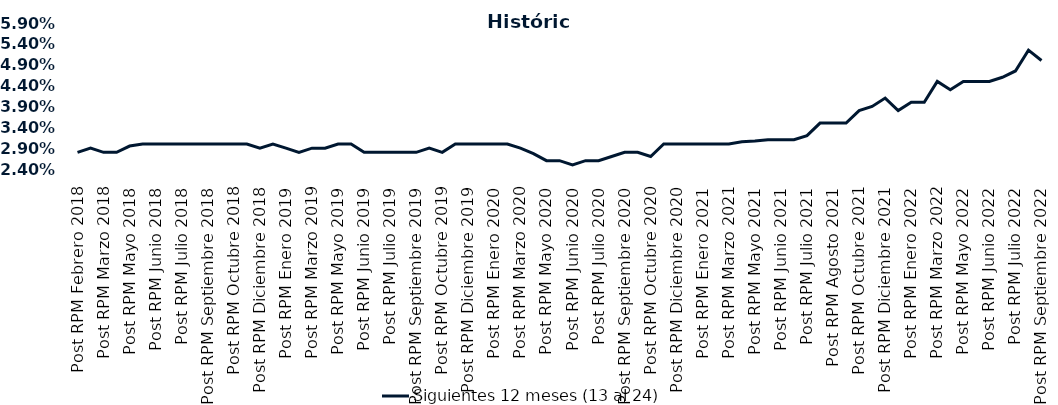
| Category | Siguientes 12 meses (13 al 24)  |
|---|---|
| Post RPM Febrero 2018 | 0.028 |
| Pre RPM Marzo 2018 | 0.029 |
| Post RPM Marzo 2018 | 0.028 |
| Pre RPM Mayo 2018 | 0.028 |
| Post RPM Mayo 2018 | 0.03 |
| Pre RPM Junio 2018 | 0.03 |
| Post RPM Junio 2018 | 0.03 |
| Pre RPM Julio 2018 | 0.03 |
| Post RPM Julio 2018 | 0.03 |
| Pre RPM Septiembre 2018 | 0.03 |
| Post RPM Septiembre 2018 | 0.03 |
| Pre RPM Octubre 2018 | 0.03 |
| Post RPM Octubre 2018 | 0.03 |
| Pre RPM Diciembre 2018 | 0.03 |
| Post RPM Diciembre 2018 | 0.029 |
| Pre RPM Enero 2019 | 0.03 |
| Post RPM Enero 2019 | 0.029 |
| Pre RPM Marzo 2019 | 0.028 |
| Post RPM Marzo 2019 | 0.029 |
| Pre RPM Mayo 2019 | 0.029 |
| Post RPM Mayo 2019 | 0.03 |
| Pre RPM Junio 2019 | 0.03 |
| Post RPM Junio 2019 | 0.028 |
| Pre RPM Julio 2019 | 0.028 |
| Post RPM Julio 2019 | 0.028 |
| Pre RPM Septiembre 2019 | 0.028 |
| Post RPM Septiembre 2019 | 0.028 |
| Pre RPM Octubre 2019 | 0.029 |
| Post RPM Octubre 2019 | 0.028 |
| Pre RPM Diciembre 2019 | 0.03 |
| Post RPM Diciembre 2019 | 0.03 |
| Pre RPM Enero 2020 | 0.03 |
| Post RPM Enero 2020 | 0.03 |
| Pre RPM Marzo 2020 | 0.03 |
| Post RPM Marzo 2020 | 0.029 |
| Pre RPM Mayo 2020 | 0.028 |
| Post RPM Mayo 2020 | 0.026 |
| Pre RPM Junio 2020 | 0.026 |
| Post RPM Junio 2020 | 0.025 |
| Pre RPM Julio 2020 | 0.026 |
| Post RPM Julio 2020 | 0.026 |
| Pre RPM Septiembre 2020 | 0.027 |
| Post RPM Septiembre 2020 | 0.028 |
| Pre RPM Octubre 2020 | 0.028 |
| Post RPM Octubre 2020 | 0.027 |
| Pre RPM Diciembre 2020 | 0.03 |
| Post RPM Diciembre 2020 | 0.03 |
| Pre RPM Enero 2021 | 0.03 |
| Post RPM Enero 2021 | 0.03 |
| Pre RPM Marzo 2021 | 0.03 |
| Post RPM Marzo 2021 | 0.03 |
| Pre RPM Mayo 2021 | 0.031 |
| Post RPM Mayo 2021 | 0.031 |
| Pre RPM Junio 2021 | 0.031 |
| Post RPM Junio 2021 | 0.031 |
| Pre RPM Julio 2021 | 0.031 |
| Post RPM Julio 2021 | 0.032 |
| Pre RPM Agosto 2021 | 0.035 |
| Post RPM Agosto 2021 | 0.035 |
| Pre RPM Octubre 2021 | 0.035 |
| Post RPM Octubre 2021 | 0.038 |
| Pre RPM Diciembre 2021 | 0.039 |
| Post RPM Diciembre 2021 | 0.041 |
| Pre RPM Enero 2022 | 0.038 |
| Post RPM Enero 2022 | 0.04 |
| Pre RPM Marzo 2022 | 0.04 |
| Post RPM Marzo 2022 | 0.045 |
| Pre RPM Mayo 2022 | 0.043 |
| Post RPM Mayo 2022 | 0.045 |
| Pre RPM Junio 2022 | 0.045 |
| Post RPM Junio 2022 | 0.045 |
| Pre RPM Julio 2022 | 0.046 |
| Post RPM Julio 2022 | 0.048 |
| Pre RPM Septiembre 2022 | 0.052 |
| Post RPM Septiembre 2022 | 0.05 |